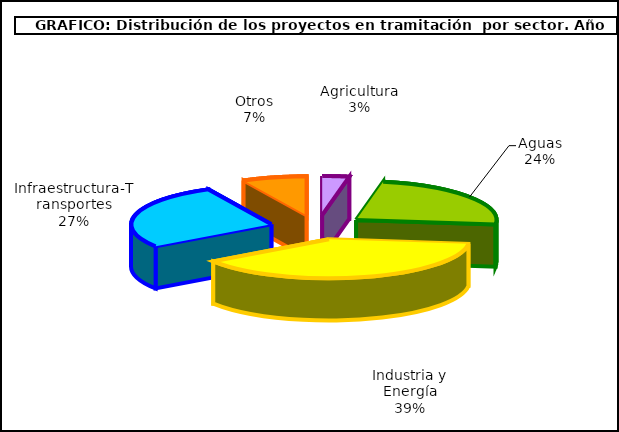
| Category | Series 0 |
|---|---|
| 0 | 10 |
| 1 | 77 |
| 2 | 125 |
| 3 | 88 |
| 4 | 24 |